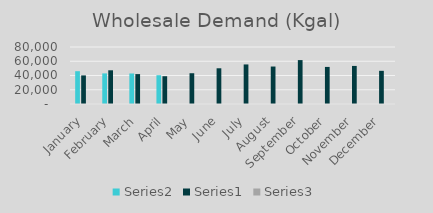
| Category | Series 1 | Series 0 | Series 2 |
|---|---|---|---|
| January | 46042 | 40140 | 1.147 |
| February | 42951.714 | 47315 | 0.908 |
| March | 42828.697 | 41977 | 1.02 |
| April | 40411.734 | 38996.46 | 1.036 |
| May | 0 | 43187.656 | 0 |
| June | 0 | 50131.03 | 0 |
| July | 0 | 55518.584 | 0 |
| August | 0 | 52591.348 | 0 |
| September | 0 | 61625.007 | 0 |
| October | 0 | 52042.125 | 0 |
| November | 0 | 53432.969 | 0 |
| December | 0 | 46567.149 | 0 |